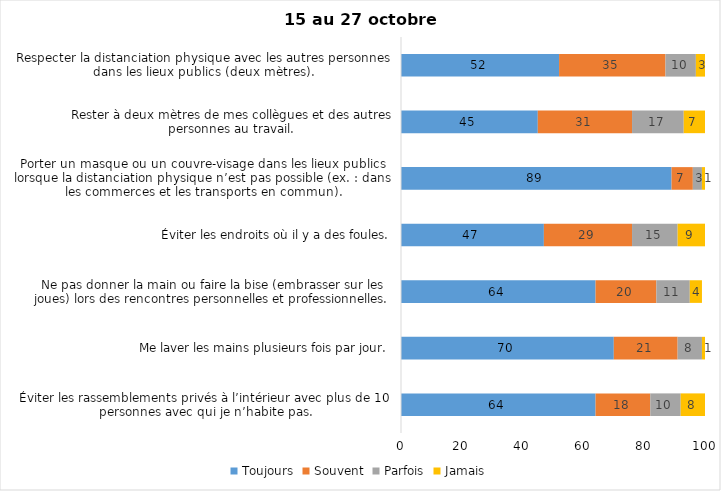
| Category | Toujours | Souvent | Parfois | Jamais |
|---|---|---|---|---|
| Éviter les rassemblements privés à l’intérieur avec plus de 10 personnes avec qui je n’habite pas. | 64 | 18 | 10 | 8 |
| Me laver les mains plusieurs fois par jour. | 70 | 21 | 8 | 1 |
| Ne pas donner la main ou faire la bise (embrasser sur les joues) lors des rencontres personnelles et professionnelles. | 64 | 20 | 11 | 4 |
| Éviter les endroits où il y a des foules. | 47 | 29 | 15 | 9 |
| Porter un masque ou un couvre-visage dans les lieux publics lorsque la distanciation physique n’est pas possible (ex. : dans les commerces et les transports en commun). | 89 | 7 | 3 | 1 |
| Rester à deux mètres de mes collègues et des autres personnes au travail. | 45 | 31 | 17 | 7 |
| Respecter la distanciation physique avec les autres personnes dans les lieux publics (deux mètres). | 52 | 35 | 10 | 3 |